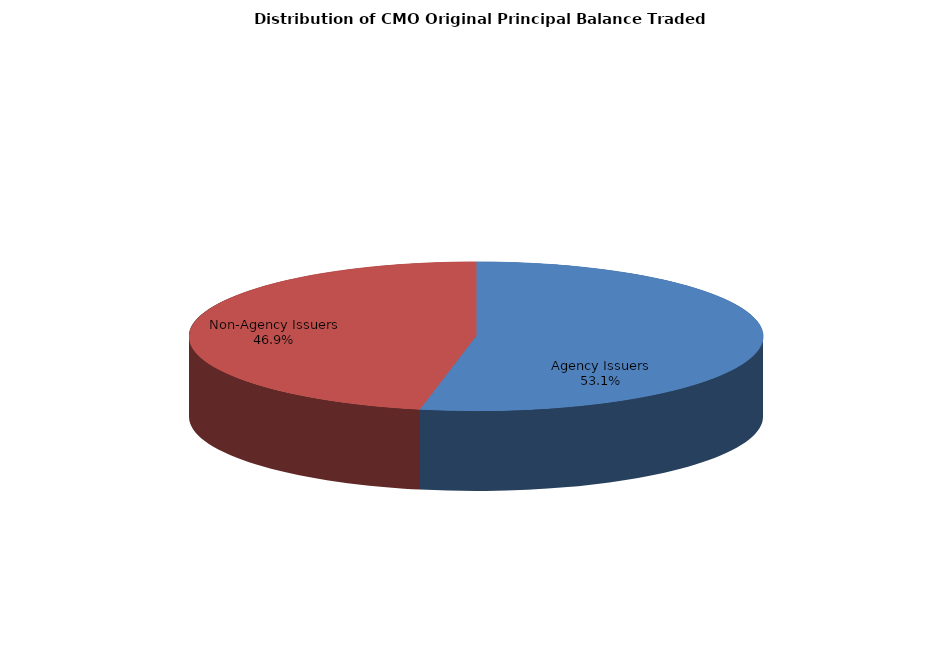
| Category | Series 0 |
|---|---|
| Agency Issuers | 6160796482.465 |
| Non-Agency Issuers | 5436524429.374 |